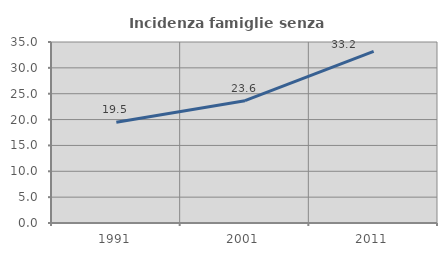
| Category | Incidenza famiglie senza nuclei |
|---|---|
| 1991.0 | 19.471 |
| 2001.0 | 23.647 |
| 2011.0 | 33.187 |